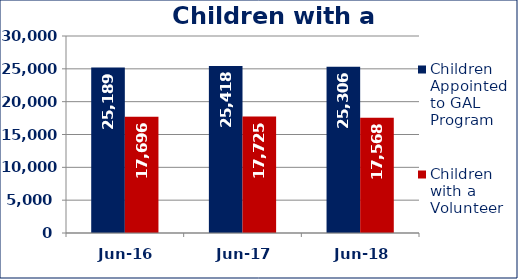
| Category | Children Appointed to GAL Program  | Children with a Volunteer  |
|---|---|---|
| Jun-16 | 25189 | 17696 |
| Jun-17 | 25418 | 17725 |
| Jun-18 | 25306 | 17568 |